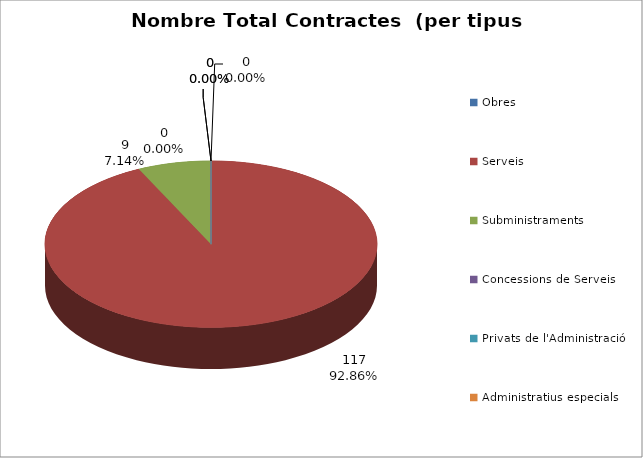
| Category | Nombre Total Contractes |
|---|---|
| Obres | 0 |
| Serveis | 117 |
| Subministraments | 9 |
| Concessions de Serveis | 0 |
| Privats de l'Administració | 0 |
| Administratius especials | 0 |